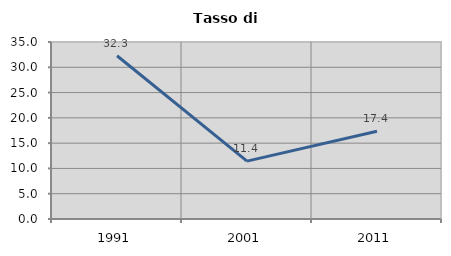
| Category | Tasso di disoccupazione   |
|---|---|
| 1991.0 | 32.277 |
| 2001.0 | 11.443 |
| 2011.0 | 17.359 |